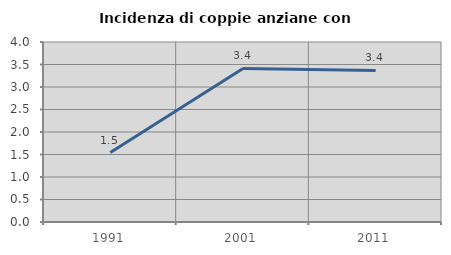
| Category | Incidenza di coppie anziane con figli |
|---|---|
| 1991.0 | 1.543 |
| 2001.0 | 3.413 |
| 2011.0 | 3.368 |